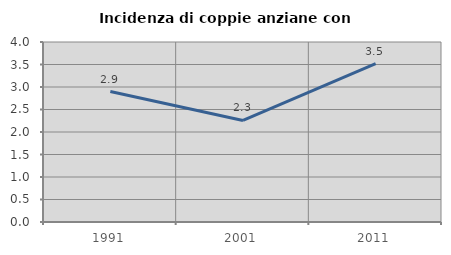
| Category | Incidenza di coppie anziane con figli |
|---|---|
| 1991.0 | 2.899 |
| 2001.0 | 2.256 |
| 2011.0 | 3.521 |